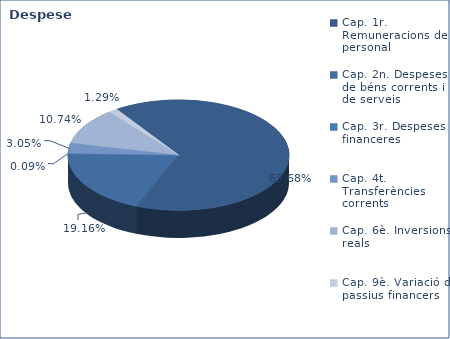
| Category | Series 0 |
|---|---|
| Cap. 1r. Remuneracions de personal | 208402149 |
| Cap. 2n. Despeses de béns corrents i de serveis | 60789311 |
| Cap. 3r. Despeses financeres | 278500 |
| Cap. 4t. Transferències corrents | 9682634 |
| Cap. 6è. Inversions reals | 34077016 |
| Cap. 9è. Variació de passius financers | 4082550 |